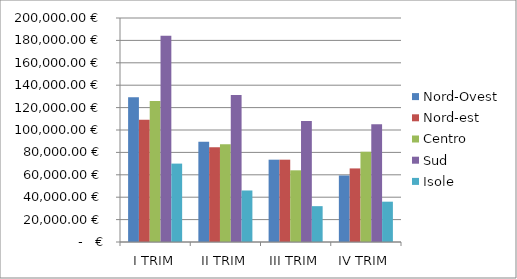
| Category | Nord-Ovest | Nord-est | Centro | Sud | Isole |
|---|---|---|---|---|---|
| I TRIM | 129200 | 109200 | 126000 | 184200 | 70000 |
| II TRIM | 89500 | 84500 | 87200 | 131200 | 46000 |
| III TRIM | 73500 | 73500 | 64000 | 108000 | 32000 |
| IV TRIM | 59400 | 65700 | 80500 | 105200 | 36000 |